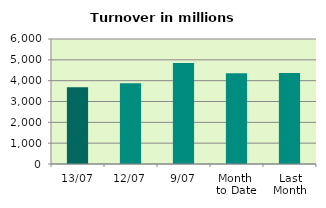
| Category | Series 0 |
|---|---|
| 13/07 | 3687.403 |
| 12/07 | 3872.343 |
| 9/07 | 4842.244 |
| Month 
to Date | 4350.563 |
| Last
Month | 4366.67 |